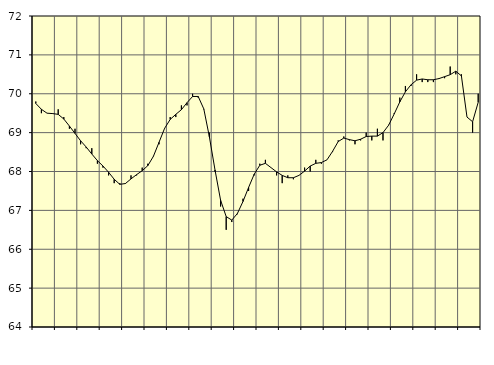
| Category | Piggar | Series 1 |
|---|---|---|
| nan | 69.8 | 69.75 |
| 1.0 | 69.5 | 69.6 |
| 1.0 | 69.5 | 69.5 |
| 1.0 | 69.5 | 69.49 |
| nan | 69.6 | 69.47 |
| 2.0 | 69.4 | 69.35 |
| 2.0 | 69.1 | 69.17 |
| 2.0 | 69.1 | 68.98 |
| nan | 68.7 | 68.79 |
| 3.0 | 68.6 | 68.63 |
| 3.0 | 68.6 | 68.45 |
| 3.0 | 68.2 | 68.28 |
| nan | 68.1 | 68.14 |
| 4.0 | 67.9 | 67.98 |
| 4.0 | 67.7 | 67.8 |
| 4.0 | 67.7 | 67.67 |
| nan | 67.7 | 67.69 |
| 5.0 | 67.9 | 67.81 |
| 5.0 | 67.9 | 67.92 |
| 5.0 | 68.1 | 68.02 |
| nan | 68.2 | 68.15 |
| 6.0 | 68.4 | 68.39 |
| 6.0 | 68.7 | 68.75 |
| 6.0 | 69.1 | 69.11 |
| nan | 69.4 | 69.34 |
| 7.0 | 69.4 | 69.47 |
| 7.0 | 69.7 | 69.59 |
| 7.0 | 69.7 | 69.77 |
| nan | 70 | 69.93 |
| 8.0 | 69.9 | 69.93 |
| 8.0 | 69.6 | 69.61 |
| 8.0 | 69 | 68.89 |
| nan | 68 | 68.04 |
| 9.0 | 67.1 | 67.26 |
| 9.0 | 66.5 | 66.84 |
| 9.0 | 66.7 | 66.75 |
| nan | 66.9 | 66.92 |
| 10.0 | 67.3 | 67.23 |
| 10.0 | 67.5 | 67.59 |
| 10.0 | 67.9 | 67.93 |
| nan | 68.2 | 68.16 |
| 11.0 | 68.3 | 68.21 |
| 11.0 | 68.1 | 68.1 |
| 11.0 | 67.9 | 67.99 |
| nan | 67.7 | 67.9 |
| 12.0 | 67.9 | 67.84 |
| 12.0 | 67.8 | 67.84 |
| 12.0 | 67.9 | 67.9 |
| nan | 68.1 | 68.01 |
| 13.0 | 68 | 68.14 |
| 13.0 | 68.3 | 68.21 |
| 13.0 | 68.2 | 68.23 |
| nan | 68.3 | 68.3 |
| 14.0 | 68.5 | 68.52 |
| 14.0 | 68.8 | 68.77 |
| 14.0 | 68.9 | 68.86 |
| nan | 68.8 | 68.82 |
| 15.0 | 68.7 | 68.79 |
| 15.0 | 68.8 | 68.83 |
| 15.0 | 69 | 68.9 |
| nan | 68.8 | 68.91 |
| 16.0 | 69.1 | 68.91 |
| 16.0 | 68.8 | 69 |
| 16.0 | 69.2 | 69.19 |
| nan | 69.5 | 69.48 |
| 17.0 | 69.9 | 69.79 |
| 17.0 | 70.2 | 70.05 |
| 17.0 | 70.2 | 70.23 |
| nan | 70.5 | 70.35 |
| 18.0 | 70.3 | 70.38 |
| 18.0 | 70.3 | 70.36 |
| 18.0 | 70.3 | 70.36 |
| nan | 70.4 | 70.39 |
| 19.0 | 70.4 | 70.44 |
| 19.0 | 70.7 | 70.49 |
| 19.0 | 70.5 | 70.58 |
| nan | 70.5 | 70.46 |
| 20.0 | 69.4 | 69.4 |
| 20.0 | 69 | 69.28 |
| 20.0 | 70 | 69.78 |